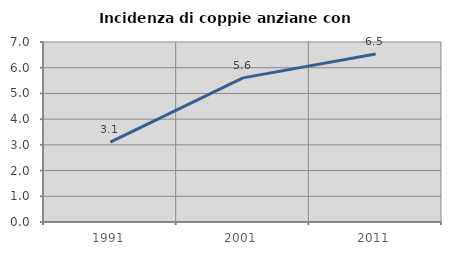
| Category | Incidenza di coppie anziane con figli |
|---|---|
| 1991.0 | 3.105 |
| 2001.0 | 5.604 |
| 2011.0 | 6.534 |